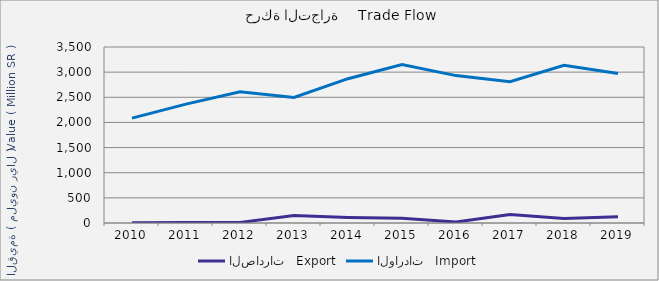
| Category | الصادرات   Export | الواردات   Import |
|---|---|---|
| 2010.0 | 5060935 | 2085454292 |
| 2011.0 | 9674971 | 2363724280 |
| 2012.0 | 11138308 | 2611178110 |
| 2013.0 | 150026178 | 2495529003 |
| 2014.0 | 111201057 | 2869779629 |
| 2015.0 | 94996742 | 3149109769 |
| 2016.0 | 19439242 | 2931268488 |
| 2017.0 | 167206465 | 2809662576 |
| 2018.0 | 87810394 | 3137877530 |
| 2019.0 | 124781888 | 2973847533 |